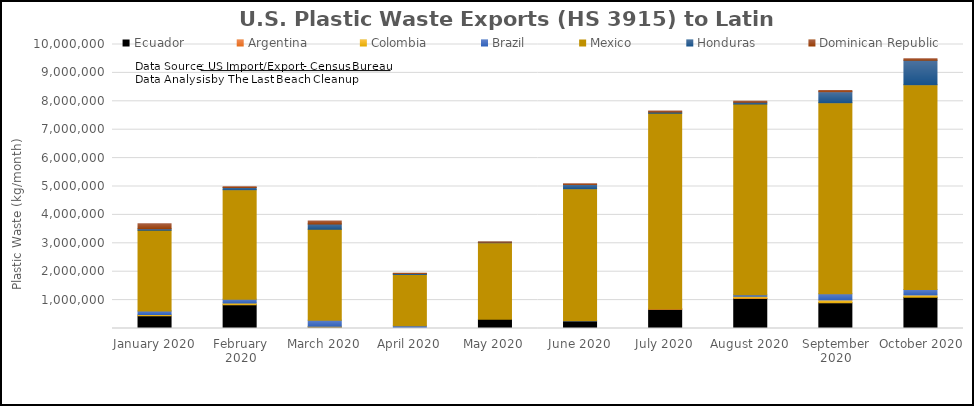
| Category | Ecuador | Argentina | Colombia | Brazil | Mexico | Honduras | Dominican Republic |
|---|---|---|---|---|---|---|---|
| January 2020 | 446384 | 0 | 42338 | 123737 | 2851411 | 48955 | 175244 |
| February 2020 | 835541 | 0 | 59191 | 134133 | 3853359 | 86803 | 25466 |
| March 2020 | 56397 | 0 | 19017 | 212672 | 3209874 | 179304 | 110306 |
| April 2020 | 0 | 0 | 0 | 98424 | 1798751 | 40000 | 9466 |
| May 2020 | 328219 | 0 | 0 | 0 | 2689389 | 17000 | 10430 |
| June 2020 | 260000 | 0 | 0 | 12221 | 4649387 | 146748 | 28293 |
| July 2020 | 678907 | 14922 | 1300 | 0 | 6885070 | 42002 | 40182 |
| August 2020 | 1059766 | 12933 | 60000 | 54473 | 6713365 | 63584 | 36802 |
| September 2020 | 907396 | 0 | 100165 | 215272 | 6724725 | 386142 | 47939 |
| October 2020 | 1102330 | 0 | 78420 | 194018 | 7206750 | 864975 | 53989 |